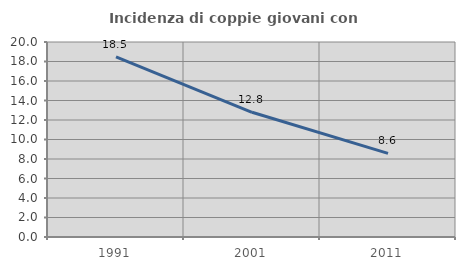
| Category | Incidenza di coppie giovani con figli |
|---|---|
| 1991.0 | 18.485 |
| 2001.0 | 12.792 |
| 2011.0 | 8.577 |